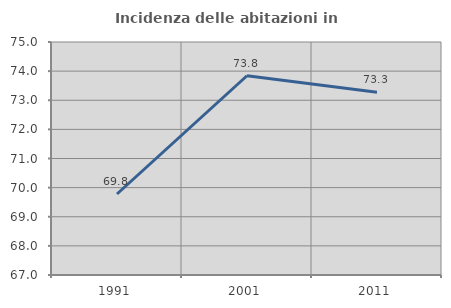
| Category | Incidenza delle abitazioni in proprietà  |
|---|---|
| 1991.0 | 69.781 |
| 2001.0 | 73.841 |
| 2011.0 | 73.278 |